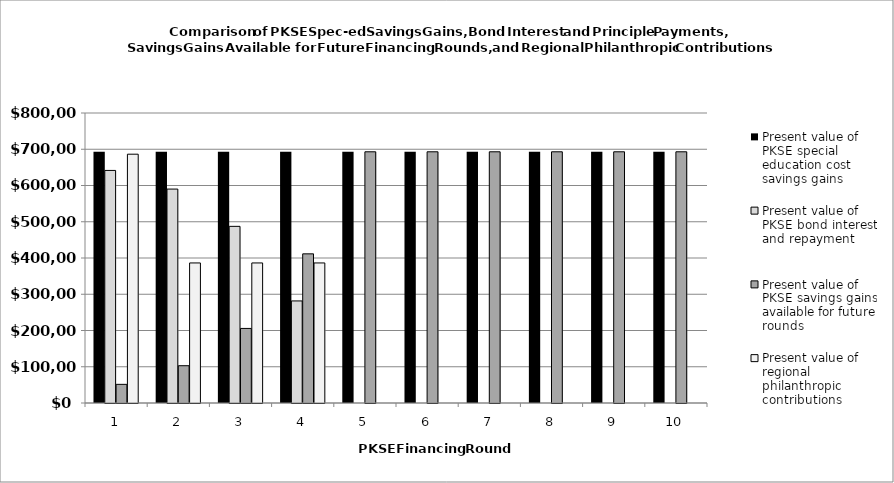
| Category | Present value of PKSE special education cost savings gains | Present value of PKSE bond interest and repayment | Present value of PKSE savings gains available for future rounds | Present value of regional philanthropic contributions |
|---|---|---|---|---|
| 0 | 693009.351 | 641581.21 | 51428.141 | 686358.961 |
| 1 | 693009.351 | 590153.069 | 102856.282 | 386358.961 |
| 2 | 693009.351 | 487296.788 | 205712.564 | 386358.961 |
| 3 | 693009.351 | 281584.224 | 411425.127 | 386358.961 |
| 4 | 693009.351 | 0 | 693009.351 | 0 |
| 5 | 693009.351 | 0 | 693009.351 | 0 |
| 6 | 693009.351 | 0 | 693009.351 | 0 |
| 7 | 693009.351 | 0 | 693009.351 | 0 |
| 8 | 693009.351 | 0 | 693009.351 | 0 |
| 9 | 693009.351 | 0 | 693009.351 | 0 |